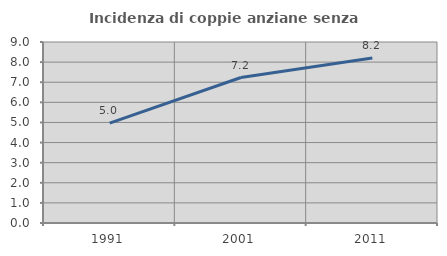
| Category | Incidenza di coppie anziane senza figli  |
|---|---|
| 1991.0 | 4.964 |
| 2001.0 | 7.234 |
| 2011.0 | 8.202 |